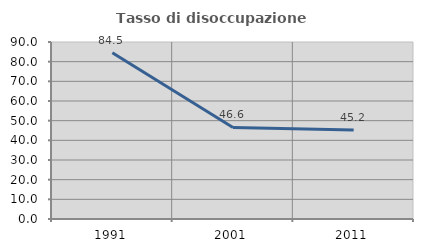
| Category | Tasso di disoccupazione giovanile  |
|---|---|
| 1991.0 | 84.536 |
| 2001.0 | 46.575 |
| 2011.0 | 45.238 |